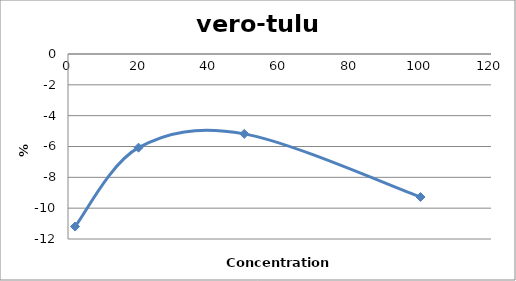
| Category | vero-tulu4 |
|---|---|
| 100.0 | -9.277 |
| 50.0 | -5.181 |
| 20.0 | -6.077 |
| 2.0 | -11.191 |
| nan | 0 |
| nan | 0 |
| nan | 0 |
| nan | 0 |
| nan | 0 |